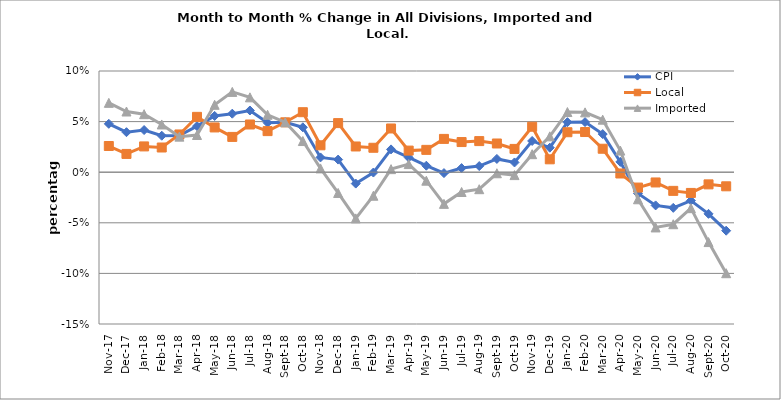
| Category | CPI | Local | Imported |
|---|---|---|---|
| 2017-11-01 | 0.048 | 0.026 | 0.069 |
| 2017-12-01 | 0.04 | 0.018 | 0.06 |
| 2018-01-01 | 0.042 | 0.025 | 0.057 |
| 2018-02-01 | 0.036 | 0.024 | 0.047 |
| 2018-03-01 | 0.036 | 0.037 | 0.035 |
| 2018-04-01 | 0.045 | 0.055 | 0.037 |
| 2018-05-01 | 0.056 | 0.044 | 0.067 |
| 2018-06-01 | 0.058 | 0.035 | 0.079 |
| 2018-07-01 | 0.061 | 0.047 | 0.074 |
| 2018-08-01 | 0.049 | 0.041 | 0.057 |
| 2018-09-01 | 0.049 | 0.049 | 0.049 |
| 2018-10-01 | 0.044 | 0.059 | 0.031 |
| 2018-11-01 | 0.015 | 0.027 | 0.004 |
| 2018-12-01 | 0.012 | 0.049 | -0.021 |
| 2019-01-01 | -0.011 | 0.025 | -0.046 |
| 2019-02-01 | 0 | 0.024 | -0.023 |
| 2019-03-01 | 0.023 | 0.043 | 0.003 |
| 2019-04-01 | 0.015 | 0.021 | 0.008 |
| 2019-05-01 | 0.006 | 0.022 | -0.008 |
| 2019-06-01 | -0.001 | 0.033 | -0.031 |
| 2019-07-01 | 0.004 | 0.03 | -0.02 |
| 2019-08-01 | 0.006 | 0.031 | -0.017 |
| 2019-09-01 | 0.013 | 0.028 | -0.001 |
| 2019-10-01 | 0.01 | 0.023 | -0.003 |
| 2019-11-01 | 0.031 | 0.045 | 0.018 |
| 2019-12-01 | 0.024 | 0.013 | 0.035 |
| 2020-01-01 | 0.049 | 0.039 | 0.059 |
| 2020-02-01 | 0.05 | 0.04 | 0.059 |
| 2020-03-01 | 0.038 | 0.023 | 0.052 |
| 2020-04-01 | 0.01 | -0.001 | 0.021 |
| 2020-05-01 | -0.021 | -0.015 | -0.027 |
| 2020-06-01 | -0.033 | -0.01 | -0.055 |
| 2020-07-01 | -0.035 | -0.018 | -0.051 |
| 2020-08-01 | -0.028 | -0.02 | -0.036 |
| 2020-09-01 | -0.041 | -0.012 | -0.069 |
| 2020-10-01 | -0.058 | -0.014 | -0.1 |